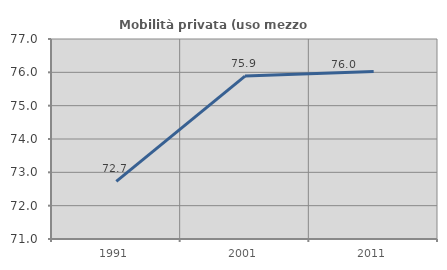
| Category | Mobilità privata (uso mezzo privato) |
|---|---|
| 1991.0 | 72.727 |
| 2001.0 | 75.887 |
| 2011.0 | 76.027 |